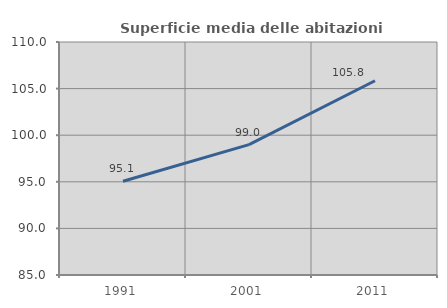
| Category | Superficie media delle abitazioni occupate |
|---|---|
| 1991.0 | 95.058 |
| 2001.0 | 98.983 |
| 2011.0 | 105.845 |